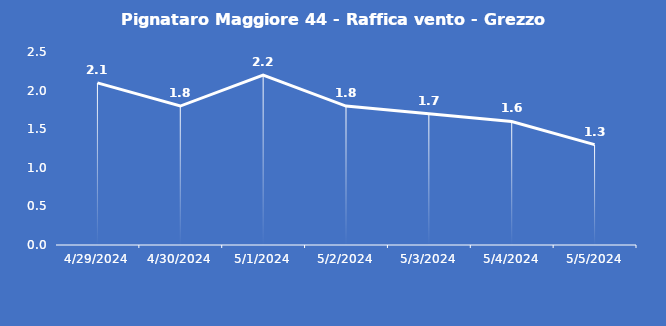
| Category | Pignataro Maggiore 44 - Raffica vento - Grezzo (m/s) |
|---|---|
| 4/29/24 | 2.1 |
| 4/30/24 | 1.8 |
| 5/1/24 | 2.2 |
| 5/2/24 | 1.8 |
| 5/3/24 | 1.7 |
| 5/4/24 | 1.6 |
| 5/5/24 | 1.3 |